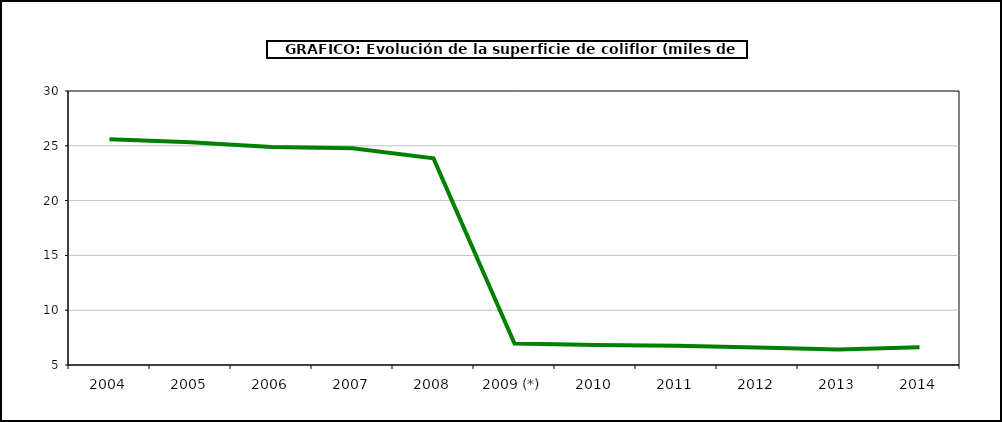
| Category | superficie |
|---|---|
| 2004 | 25.593 |
| 2005 | 25.323 |
| 2006 | 24.9 |
| 2007 | 24.768 |
| 2008 | 23.857 |
| 2009 (*) | 6.965 |
| 2010 | 6.826 |
| 2011 | 6.759 |
| 2012 | 6.587 |
| 2013 | 6.418 |
| 2014 | 6.61 |